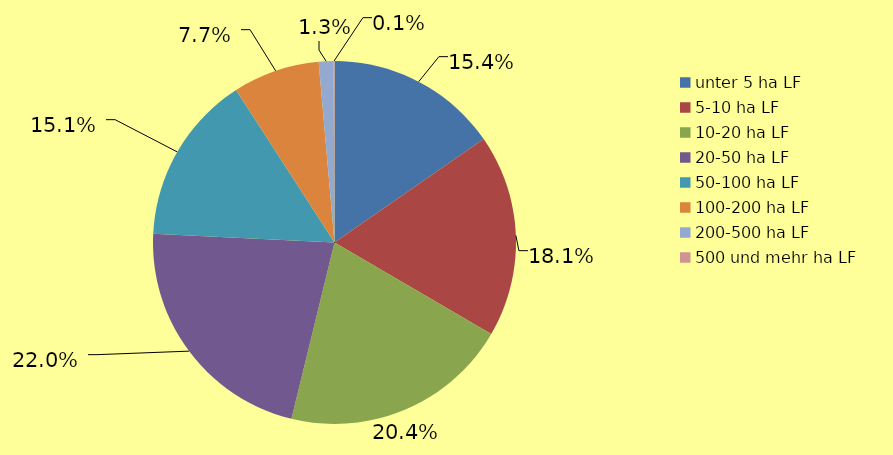
| Category | Series 0 |
|---|---|
| unter 5 ha LF | 5840 |
| 5-10 ha LF | 6870 |
| 10-20 ha LF | 7760 |
| 20-50 ha LF | 8350 |
| 50-100 ha LF | 5750 |
| 100-200 ha LF | 2940 |
| 200-500 ha LF | 500 |
| 500 und mehr ha LF | 30 |